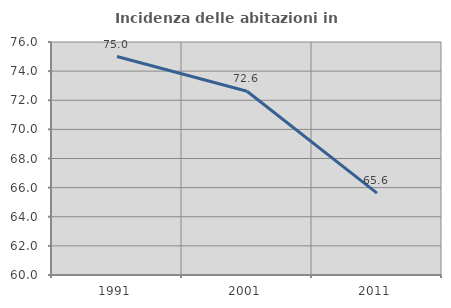
| Category | Incidenza delle abitazioni in proprietà  |
|---|---|
| 1991.0 | 75 |
| 2001.0 | 72.619 |
| 2011.0 | 65.625 |